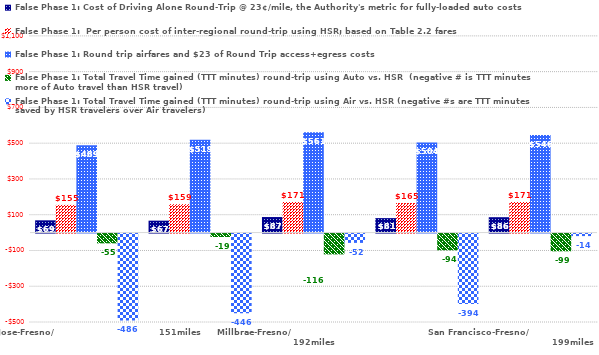
| Category | False Phase 1: Cost of Driving Alone Round-Trip @ 23¢/mile, the Authority's metric for fully-loaded auto costs | False Phase 1:  Per person cost of inter-regional round-trip using HSR; based on Table 2.2 fares | False Phase 1: Round trip airfares and $23 of Round Trip access+egress costs | False Phase 1: Total Travel Time gained (TTT minutes) round-trip using Auto vs. HSR  (negative # is TTT minutes more of Auto travel than HSR travel) | False Phase 1: Total Travel Time gained (TTT minutes) round-trip using Air vs. HSR (negative #s are TTT minutes saved by HSR travelers over Air travelers) |
|---|---|---|---|---|---|
| San Jose-Fresno/                                   151miles | 68.54 | 155 | 489 | -54.5 | -486 |
| Giroy-KT/Hanford/                                              165miles | 66.7 | 159 | 519 | -19.1 | -446 |
| Millbrae-Fresno/                                            192miles | 86.94 | 171 | 561 | -116.3 | -52 |
| San Jose-KT Hanford/                                             195miles | 80.96 | 165 | 504 | -93.6 | -394 |
| San Francisco-Fresno/                                                                  199miles | 86.02 | 171 | 546 | -99 | -14 |